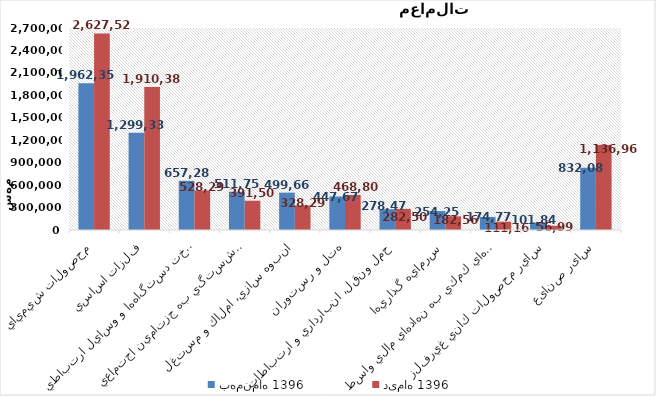
| Category | بهمن‌ماه 1396 | دی‌ماه 1396 |
|---|---|---|
| محصولات شيميايي | 1962355.503 | 2627526.865 |
| فلزات اساسي | 1299336.473 | 1910387.582 |
| ساخت دستگاه‌ها و وسايل ارتباطي | 657285.905 | 528296.49 |
| بيمه وصندوق بازنشستگي به جزتامين اجتماعي | 511752.901 | 391499.699 |
| انبوه سازي، املاك و مستغلات | 499662.258 | 328294.715 |
| هتل و رستوران | 447670.822 | 468805.605 |
| حمل ونقل، انبارداري و ارتباطات | 278477.766 | 282508.283 |
| سرمايه گذاريها | 254257.25 | 182561.405 |
| فعاليتهاي كمكي به نهادهاي مالي واسط | 174776.759 | 111168.127 |
| ساير محصولات كاني غيرفلزي | 101843.38 | 56996.065 |
| سایر صنایع | 832082.862 | 1136967.86 |